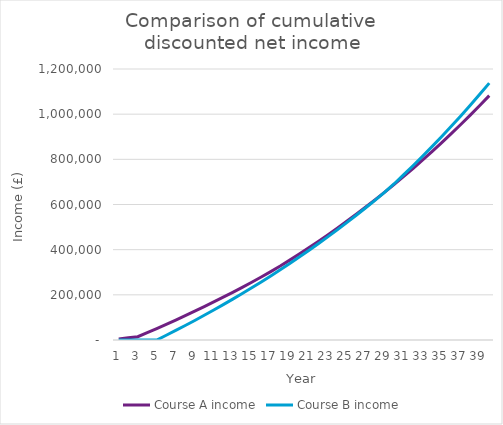
| Category | Course A income | Course B income |
|---|---|---|
| 0 | 4938.648 | 0 |
| 1 | 9756.841 | 0 |
| 2 | 14457.517 | 0 |
| 3 | 32343.017 | 0 |
| 4 | 50597.636 | 0 |
| 5 | 69232.014 | 20952.217 |
| 6 | 88257.01 | 42351.585 |
| 7 | 107683.71 | 64210.568 |
| 8 | 127523.431 | 86541.896 |
| 9 | 147787.73 | 109358.573 |
| 10 | 168488.41 | 132673.884 |
| 11 | 189637.524 | 156501.401 |
| 12 | 211247.388 | 180854.994 |
| 13 | 233330.583 | 205748.839 |
| 14 | 255899.964 | 231197.423 |
| 15 | 278968.669 | 257215.554 |
| 16 | 302550.123 | 283818.371 |
| 17 | 327321.192 | 311021.354 |
| 18 | 353652.836 | 338840.326 |
| 19 | 380626.715 | 367291.47 |
| 20 | 408258.493 | 396391.337 |
| 21 | 436564.218 | 426156.85 |
| 22 | 465560.326 | 456605.321 |
| 23 | 495263.656 | 487754.457 |
| 24 | 525691.457 | 519622.371 |
| 25 | 556861.4 | 552227.593 |
| 26 | 588791.586 | 585589.082 |
| 27 | 621500.556 | 619726.232 |
| 28 | 655007.306 | 654658.892 |
| 29 | 689331.294 | 692040.676 |
| 30 | 724492.453 | 731905.935 |
| 31 | 760511.201 | 772743.518 |
| 32 | 797408.454 | 814577.139 |
| 33 | 835205.641 | 857431.092 |
| 34 | 873924.711 | 901330.264 |
| 35 | 913588.148 | 946300.147 |
| 36 | 954218.986 | 992366.856 |
| 37 | 995840.819 | 1039557.144 |
| 38 | 1038477.82 | 1087898.415 |
| 39 | 1082154.747 | 1137418.741 |